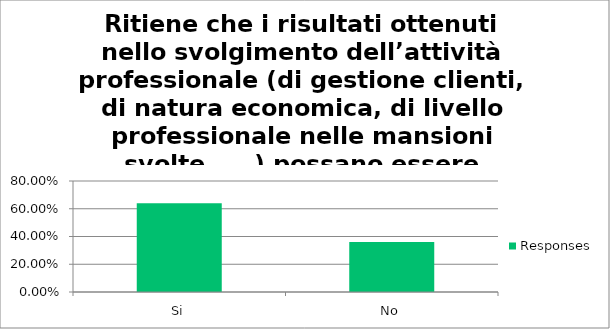
| Category | Responses |
|---|---|
| Si | 0.639 |
| No | 0.361 |